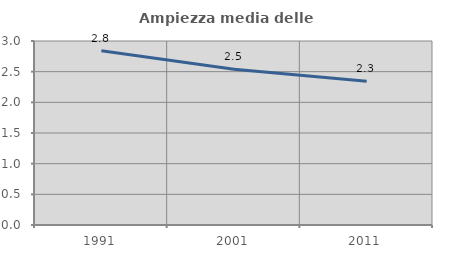
| Category | Ampiezza media delle famiglie |
|---|---|
| 1991.0 | 2.842 |
| 2001.0 | 2.54 |
| 2011.0 | 2.342 |